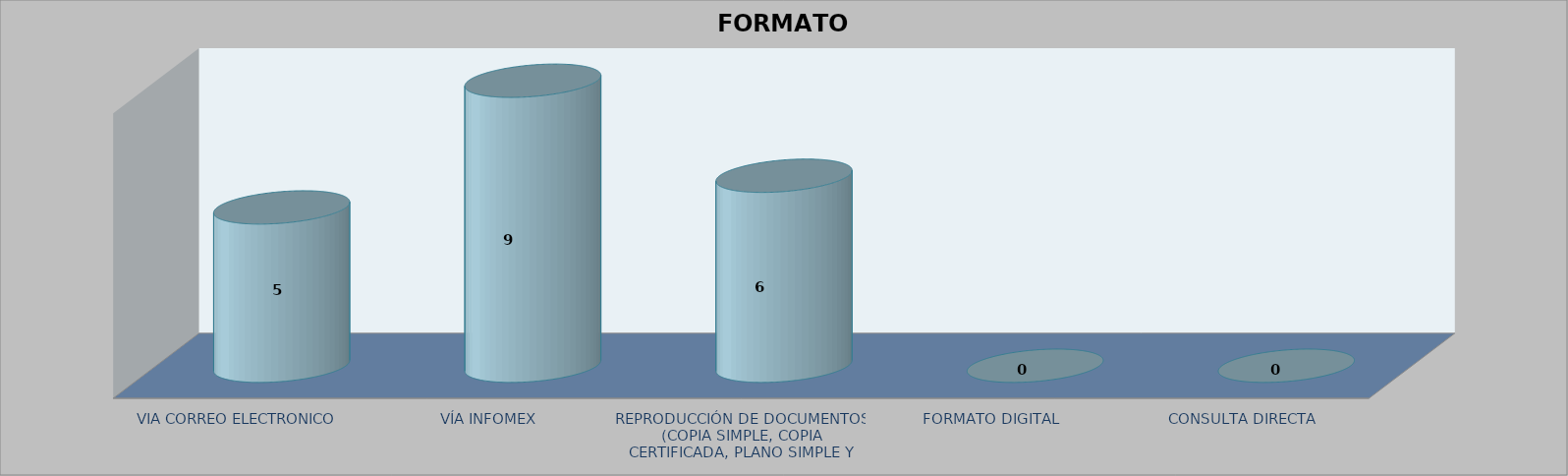
| Category |        FORMATO SOLICITADO | Series 1 | Series 2 |
|---|---|---|---|
| VIA CORREO ELECTRONICO |  |  | 5 |
| VÍA INFOMEX |  |  | 9 |
| REPRODUCCIÓN DE DOCUMENTOS (COPIA SIMPLE, COPIA CERTIFICADA, PLANO SIMPLE Y PLANO CERTIFICADO) |  |  | 6 |
| FORMATO DIGITAL |  |  | 0 |
| CONSULTA DIRECTA |  |  | 0 |